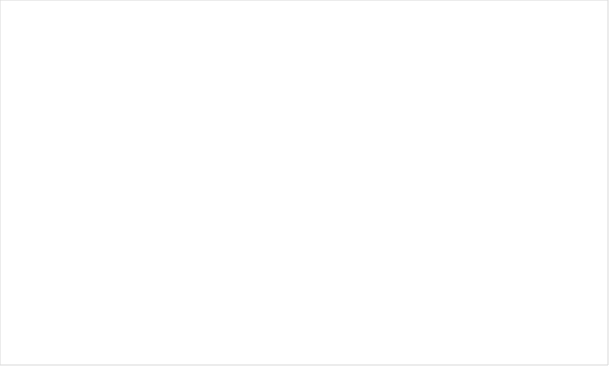
| Category | Ingen brist | Föreläggande |
|---|---|---|
| grundskola | 0.949 | 0.051 |
| gymnasieskola | 0.967 | 0.033 |